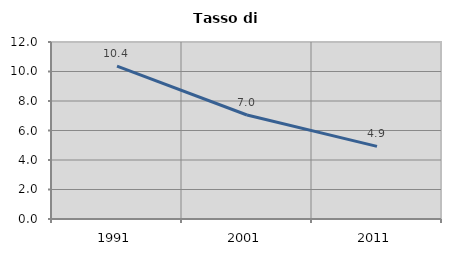
| Category | Tasso di disoccupazione   |
|---|---|
| 1991.0 | 10.363 |
| 2001.0 | 7.049 |
| 2011.0 | 4.922 |